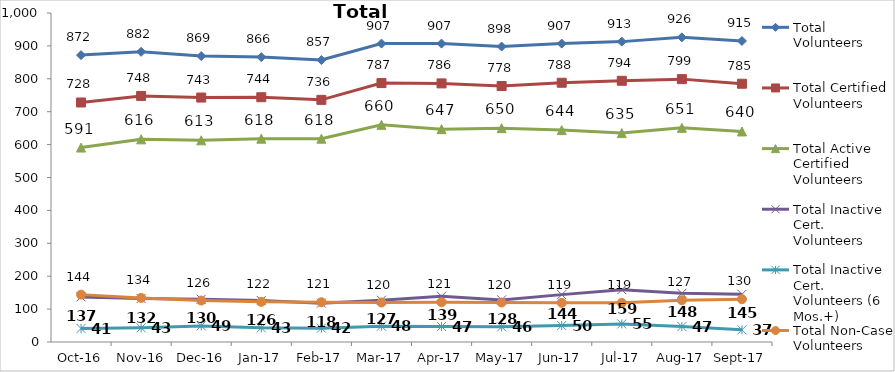
| Category | Total Volunteers | Total Certified Volunteers | Total Active Certified Volunteers | Total Inactive Cert. Volunteers | Total Inactive Cert. Volunteers (6 Mos.+) | Total Non-Case Volunteers |
|---|---|---|---|---|---|---|
| 2016-10-01 | 872 | 728 | 591 | 137 | 41 | 144 |
| 2016-11-01 | 882 | 748 | 616 | 132 | 43 | 134 |
| 2016-12-01 | 869 | 743 | 613 | 130 | 49 | 126 |
| 2017-01-01 | 866 | 744 | 618 | 126 | 43 | 122 |
| 2017-02-01 | 857 | 736 | 618 | 118 | 42 | 121 |
| 2017-03-01 | 907 | 787 | 660 | 127 | 48 | 120 |
| 2017-04-01 | 907 | 786 | 647 | 139 | 47 | 121 |
| 2017-05-01 | 898 | 778 | 650 | 128 | 46 | 120 |
| 2017-06-01 | 907 | 788 | 644 | 144 | 50 | 119 |
| 2017-07-01 | 913 | 794 | 635 | 159 | 55 | 119 |
| 2017-08-01 | 926 | 799 | 651 | 148 | 47 | 127 |
| 2017-09-01 | 915 | 785 | 640 | 145 | 37 | 130 |